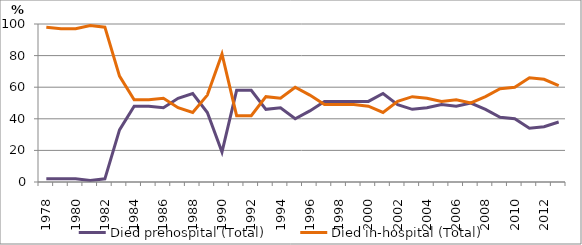
| Category | Died prehospital (Total) | Died in-hospital (Total) |
|---|---|---|
| 1978.0 | 2 | 98 |
| 1979.0 | 2 | 97 |
| 1980.0 | 2 | 97 |
| 1981.0 | 1 | 99 |
| 1982.0 | 2 | 98 |
| 1983.0 | 33 | 67 |
| 1984.0 | 48 | 52 |
| 1985.0 | 48 | 52 |
| 1986.0 | 47 | 53 |
| 1987.0 | 53 | 47 |
| 1988.0 | 56 | 44 |
| 1989.0 | 44 | 55 |
| 1990.0 | 19 | 81 |
| 1991.0 | 58 | 42 |
| 1992.0 | 58 | 42 |
| 1993.0 | 46 | 54 |
| 1994.0 | 47 | 53 |
| 1995.0 | 40 | 60 |
| 1996.0 | 45 | 55 |
| 1997.0 | 51 | 49 |
| 1998.0 | 51 | 49 |
| 1999.0 | 51 | 49 |
| 2000.0 | 51 | 48 |
| 2001.0 | 56 | 44 |
| 2002.0 | 49 | 51 |
| 2003.0 | 46 | 54 |
| 2004.0 | 47 | 53 |
| 2005.0 | 49 | 51 |
| 2006.0 | 48 | 52 |
| 2007.0 | 50 | 50 |
| 2008.0 | 46 | 54 |
| 2009.0 | 41 | 59 |
| 2010.0 | 40 | 60 |
| 2011.0 | 34 | 66 |
| 2012.0 | 35 | 65 |
| 2013.0 | 38 | 61 |